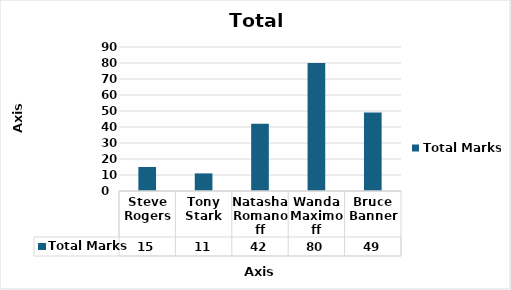
| Category | Total Marks |
|---|---|
| Steve Rogers | 15 |
| Tony Stark | 11 |
| Natasha Romanoff | 42 |
| Wanda Maximoff | 80 |
| Bruce Banner | 49 |